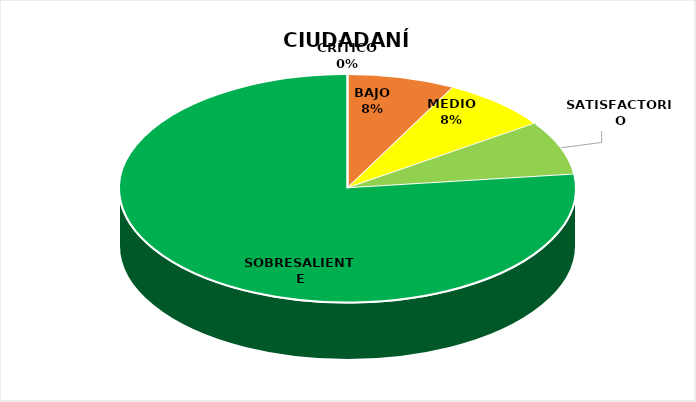
| Category | Series 0 |
|---|---|
| CRÍTICO | 0 |
| BAJO | 1 |
| MEDIO | 1 |
| SATISFACTORIO | 1 |
| SOBRESALIENTE | 10 |